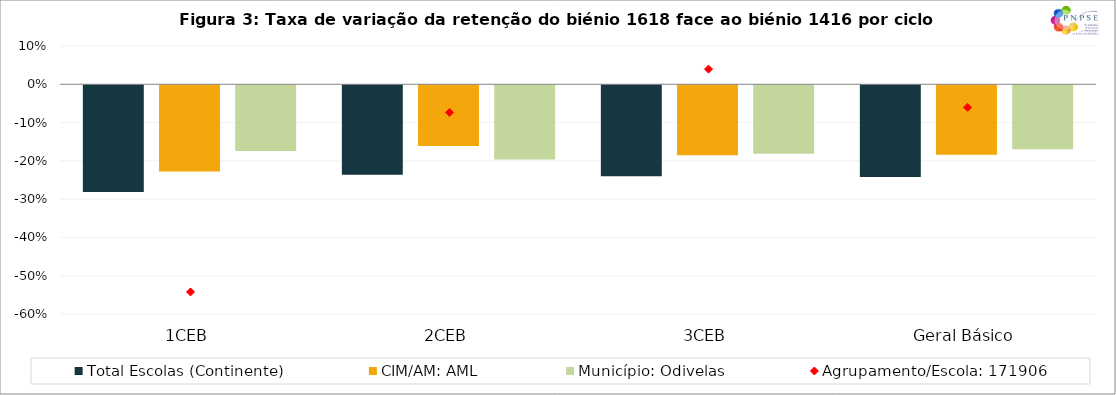
| Category | Total Escolas | CIM/AM: | Município: |
|---|---|---|---|
| 1CEB | -0.279 | -0.225 | -0.171 |
| 2CEB | -0.233 | -0.159 | -0.194 |
| 3CEB | -0.237 | -0.183 | -0.179 |
| Geral Básico | -0.24 | -0.182 | -0.167 |